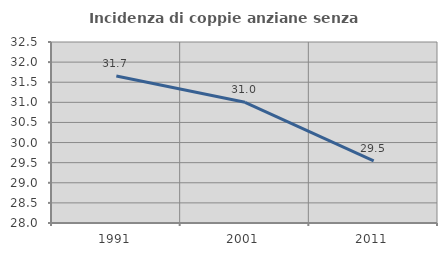
| Category | Incidenza di coppie anziane senza figli  |
|---|---|
| 1991.0 | 31.655 |
| 2001.0 | 31 |
| 2011.0 | 29.545 |